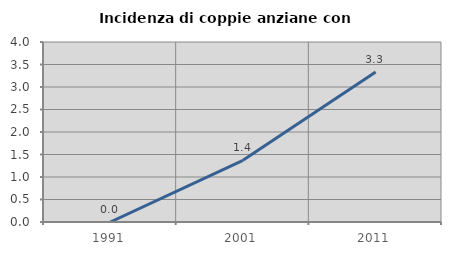
| Category | Incidenza di coppie anziane con figli |
|---|---|
| 1991.0 | 0 |
| 2001.0 | 1.37 |
| 2011.0 | 3.333 |